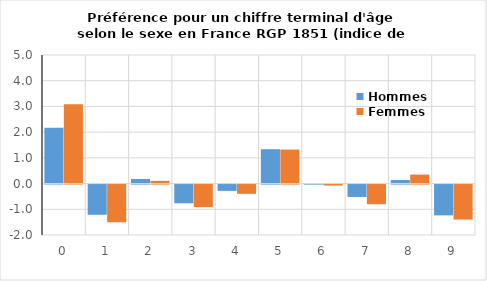
| Category | Hommes | Femmes |
|---|---|---|
| 0.0 | 2.175 | 3.086 |
| 1.0 | -1.174 | -1.467 |
| 2.0 | 0.179 | 0.107 |
| 3.0 | -0.727 | -0.875 |
| 4.0 | -0.245 | -0.361 |
| 5.0 | 1.337 | 1.323 |
| 6.0 | -0.002 | -0.038 |
| 7.0 | -0.482 | -0.765 |
| 8.0 | 0.137 | 0.35 |
| 9.0 | -1.198 | -1.361 |